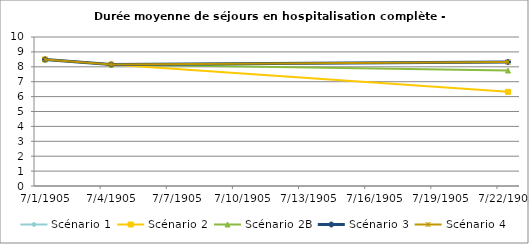
| Category | Scénario 1 | Scénario 2 | Scénario 2B | Scénario 3 | Scénario 4 |
|---|---|---|---|---|---|
| 2009.0 | 8.495 | 8.495 | 8.495 | 8.495 | 8.495 |
| 2012.0 | 8.154 | 8.154 | 8.154 | 8.154 | 8.154 |
| 2030.0 | 8.322 | 6.319 | 7.75 | 8.322 | 8.322 |